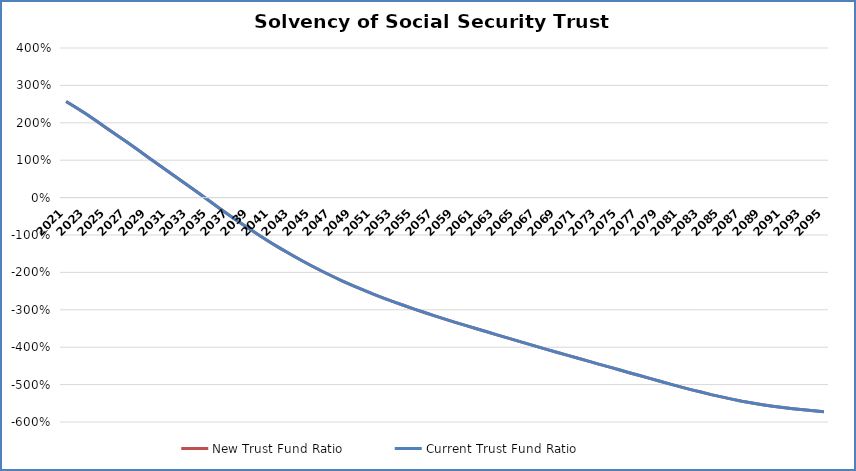
| Category | New Trust Fund Ratio | Current Trust Fund Ratio |
|---|---|---|
| 2021.0 | 2.572 | 2.572 |
| 2022.0 | 2.4 | 2.4 |
| 2023.0 | 2.228 | 2.228 |
| 2024.0 | 2.042 | 2.042 |
| 2025.0 | 1.849 | 1.849 |
| 2026.0 | 1.662 | 1.662 |
| 2027.0 | 1.471 | 1.471 |
| 2028.0 | 1.278 | 1.278 |
| 2029.0 | 1.079 | 1.079 |
| 2030.0 | 0.885 | 0.885 |
| 2031.0 | 0.693 | 0.693 |
| 2032.0 | 0.5 | 0.5 |
| 2033.0 | 0.305 | 0.305 |
| 2034.0 | 0.109 | 0.109 |
| 2035.0 | -0.092 | -0.092 |
| 2036.0 | -0.291 | -0.291 |
| 2037.0 | -0.485 | -0.485 |
| 2038.0 | -0.673 | -0.673 |
| 2039.0 | -0.856 | -0.856 |
| 2040.0 | -1.033 | -1.033 |
| 2041.0 | -1.205 | -1.205 |
| 2042.0 | -1.37 | -1.37 |
| 2043.0 | -1.53 | -1.53 |
| 2044.0 | -1.683 | -1.683 |
| 2045.0 | -1.829 | -1.829 |
| 2046.0 | -1.97 | -1.97 |
| 2047.0 | -2.104 | -2.104 |
| 2048.0 | -2.231 | -2.231 |
| 2049.0 | -2.353 | -2.353 |
| 2050.0 | -2.469 | -2.469 |
| 2051.0 | -2.581 | -2.581 |
| 2052.0 | -2.686 | -2.686 |
| 2053.0 | -2.788 | -2.788 |
| 2054.0 | -2.886 | -2.886 |
| 2055.0 | -2.981 | -2.981 |
| 2056.0 | -3.073 | -3.073 |
| 2057.0 | -3.162 | -3.162 |
| 2058.0 | -3.249 | -3.249 |
| 2059.0 | -3.335 | -3.335 |
| 2060.0 | -3.418 | -3.418 |
| 2061.0 | -3.501 | -3.501 |
| 2062.0 | -3.581 | -3.581 |
| 2063.0 | -3.663 | -3.663 |
| 2064.0 | -3.745 | -3.745 |
| 2065.0 | -3.825 | -3.825 |
| 2066.0 | -3.906 | -3.906 |
| 2067.0 | -3.985 | -3.985 |
| 2068.0 | -4.063 | -4.063 |
| 2069.0 | -4.141 | -4.141 |
| 2070.0 | -4.218 | -4.218 |
| 2071.0 | -4.295 | -4.295 |
| 2072.0 | -4.373 | -4.373 |
| 2073.0 | -4.451 | -4.451 |
| 2074.0 | -4.526 | -4.526 |
| 2075.0 | -4.604 | -4.604 |
| 2076.0 | -4.682 | -4.682 |
| 2077.0 | -4.757 | -4.757 |
| 2078.0 | -4.835 | -4.835 |
| 2079.0 | -4.911 | -4.911 |
| 2080.0 | -4.987 | -4.987 |
| 2081.0 | -5.061 | -5.061 |
| 2082.0 | -5.133 | -5.133 |
| 2083.0 | -5.2 | -5.2 |
| 2084.0 | -5.267 | -5.267 |
| 2085.0 | -5.328 | -5.328 |
| 2086.0 | -5.388 | -5.388 |
| 2087.0 | -5.445 | -5.445 |
| 2088.0 | -5.492 | -5.492 |
| 2089.0 | -5.537 | -5.537 |
| 2090.0 | -5.577 | -5.577 |
| 2091.0 | -5.613 | -5.613 |
| 2092.0 | -5.645 | -5.645 |
| 2093.0 | -5.674 | -5.674 |
| 2094.0 | -5.698 | -5.698 |
| 2095.0 | -5.725 | -5.725 |